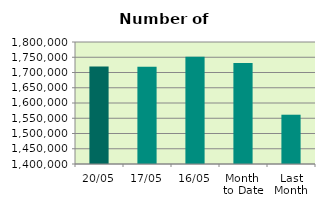
| Category | Series 0 |
|---|---|
| 20/05 | 1719868 |
| 17/05 | 1719118 |
| 16/05 | 1751882 |
| Month 
to Date | 1730873.231 |
| Last
Month | 1561575.6 |